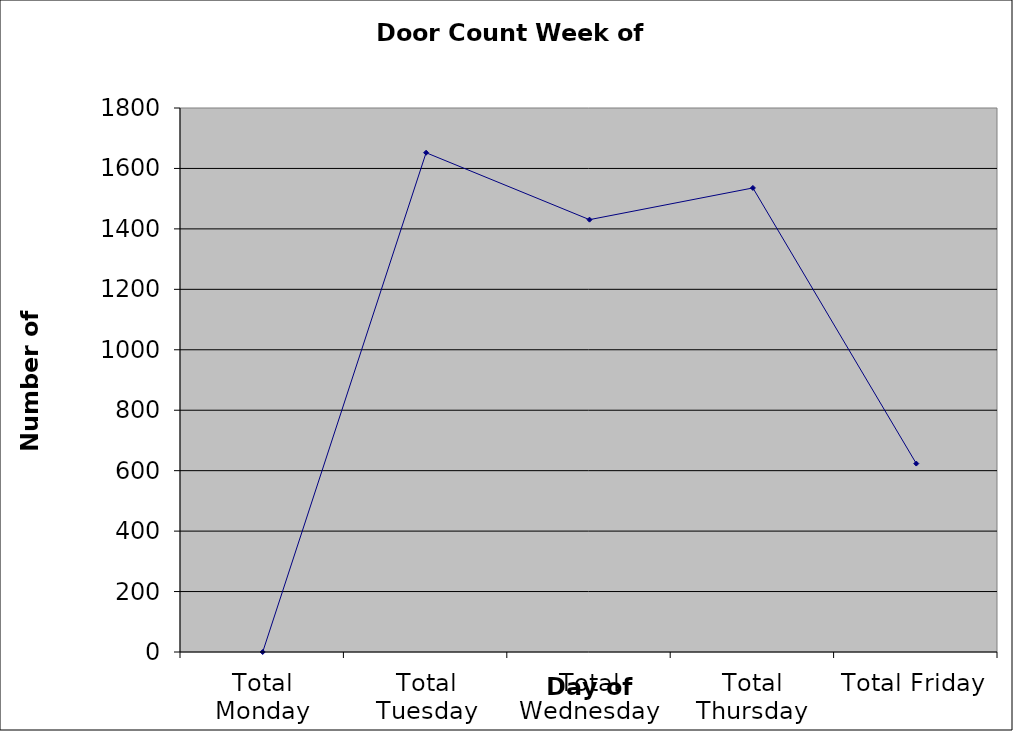
| Category | Series 0 |
|---|---|
| Total Monday | 0 |
| Total Tuesday | 1652 |
| Total Wednesday | 1430.5 |
| Total Thursday | 1535.5 |
| Total Friday | 623.5 |